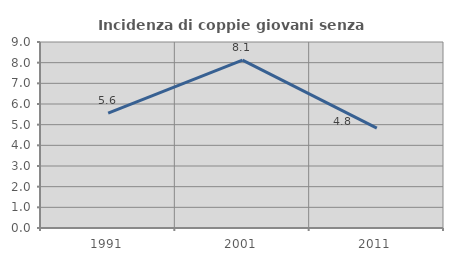
| Category | Incidenza di coppie giovani senza figli |
|---|---|
| 1991.0 | 5.556 |
| 2001.0 | 8.125 |
| 2011.0 | 4.832 |